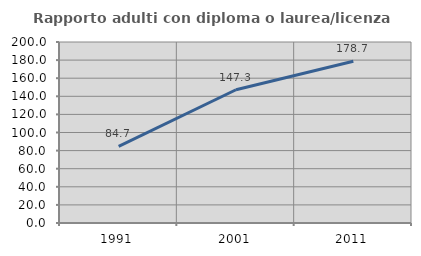
| Category | Rapporto adulti con diploma o laurea/licenza media  |
|---|---|
| 1991.0 | 84.706 |
| 2001.0 | 147.253 |
| 2011.0 | 178.652 |